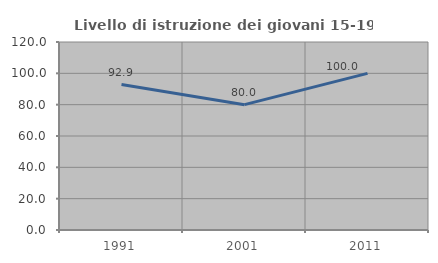
| Category | Livello di istruzione dei giovani 15-19 anni |
|---|---|
| 1991.0 | 92.857 |
| 2001.0 | 80 |
| 2011.0 | 100 |